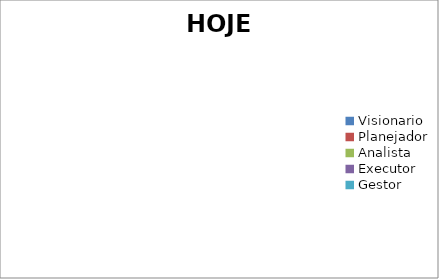
| Category | HOJE |
|---|---|
| Visionario | 0 |
| Planejador | 0 |
| Analista | 0 |
| Executor | 0 |
| Gestor | 0 |